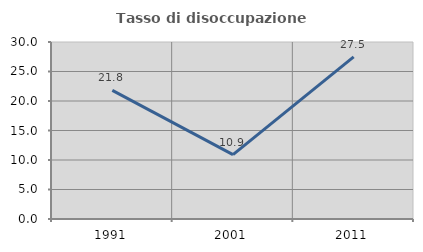
| Category | Tasso di disoccupazione giovanile  |
|---|---|
| 1991.0 | 21.795 |
| 2001.0 | 10.902 |
| 2011.0 | 27.488 |